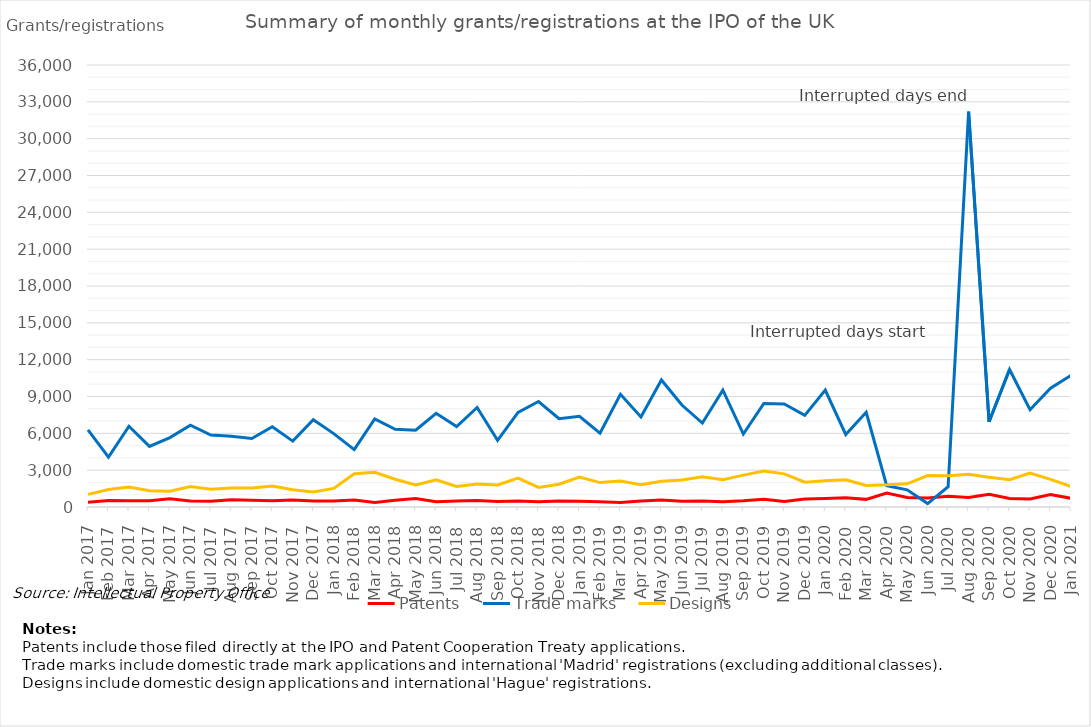
| Category | Patents | Trade marks | Designs |
|---|---|---|---|
| Jan 2017 | 387 | 6288 | 1026 |
| Feb 2017 | 533 | 4063 | 1420 |
| Mar 2017 | 505 | 6576 | 1631 |
| Apr 2017 | 516 | 4937 | 1318 |
| May 2017 | 681 | 5651 | 1284 |
| Jun 2017 | 495 | 6659 | 1660 |
| Jul 2017 | 466 | 5857 | 1437 |
| Aug 2017 | 592 | 5763 | 1550 |
| Sep 2017 | 554 | 5578 | 1553 |
| Oct 2017 | 517 | 6539 | 1705 |
| Nov 2017 | 578 | 5364 | 1397 |
| Dec 2017 | 487 | 7101 | 1218 |
| Jan 2018 | 495 | 5978 | 1512 |
| Feb 2018 | 574 | 4670 | 2704 |
| Mar 2018 | 370 | 7176 | 2825 |
| Apr 2018 | 543 | 6332 | 2259 |
| May 2018 | 690 | 6251 | 1789 |
| Jun 2018 | 424 | 7636 | 2222 |
| Jul 2018 | 486 | 6547 | 1678 |
| Aug 2018 | 536 | 8103 | 1878 |
| Sep 2018 | 450 | 5426 | 1795 |
| Oct 2018 | 498 | 7699 | 2348 |
| Nov 2018 | 432 | 8591 | 1592 |
| Dec 2018 | 484 | 7189 | 1859 |
| Jan 2019 | 475 | 7393 | 2444 |
| Feb 2019 | 426 | 6021 | 1987 |
| Mar 2019 | 363 | 9184 | 2125 |
| Apr 2019 | 488 | 7335 | 1810 |
| May 2019 | 573 | 10345 | 2096 |
| Jun 2019 | 471 | 8304 | 2202 |
| Jul 2019 | 489 | 6839 | 2464 |
| Aug 2019 | 420 | 9515 | 2218 |
| Sep 2019 | 500 | 5942 | 2596 |
| Oct 2019 | 634 | 8436 | 2926 |
| Nov 2019 | 455 | 8398 | 2700 |
| Dec 2019 | 654 | 7465 | 2021 |
| Jan 2020 | 696 | 9517 | 2145 |
| Feb 2020 | 756 | 5905 | 2220 |
| Mar 2020 | 622 | 7719 | 1758 |
| Apr 2020 | 1143 | 1741 | 1803 |
| May 2020 | 768 | 1398 | 1888 |
| Jun 2020 | 740 | 280 | 2564 |
| Jul 2020 | 878 | 1657 | 2539 |
| Aug 2020 | 771 | 32198 | 2665 |
| Sep 2020 | 1042 | 6941 | 2425 |
| Oct 2020 | 697 | 11197 | 2223 |
| Nov 2020 | 649 | 7926 | 2763 |
| Dec 2020 | 1010 | 9680 | 2252 |
| Jan 2021 | 708 | 10725 | 1667 |